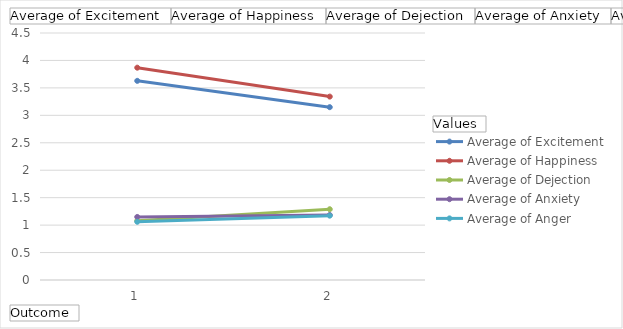
| Category | Average of Excitement | Average of Happiness | Average of Dejection | Average of Anxiety | Average of Anger |
|---|---|---|---|---|---|
| 1 | 3.628 | 3.868 | 1.078 | 1.149 | 1.061 |
| 2 | 3.149 | 3.341 | 1.289 | 1.184 | 1.172 |